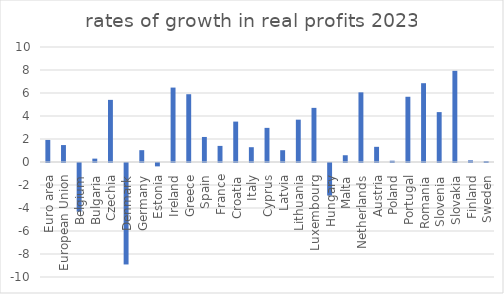
| Category | Series 0 |
|---|---|
| Euro area | 1.918 |
| European Union | 1.473 |
| Belgium | -4.234 |
| Bulgaria | 0.293 |
| Czechia | 5.403 |
| Denmark | -8.822 |
| Germany | 1.029 |
| Estonia | -0.293 |
| Ireland | 6.471 |
| Greece | 5.894 |
| Spain | 2.177 |
| France | 1.4 |
| Croatia | 3.513 |
| Italy | 1.286 |
| Cyprus | 2.968 |
| Latvia | 1.025 |
| Lithuania | 3.681 |
| Luxembourg | 4.707 |
| Hungary | -2.829 |
| Malta | 0.587 |
| Netherlands | 6.057 |
| Austria | 1.319 |
| Poland | 0.113 |
| Portugal | 5.672 |
| Romania | 6.852 |
| Slovenia | 4.339 |
| Slovakia | 7.927 |
| Finland | 0.144 |
| Sweden | 0.075 |